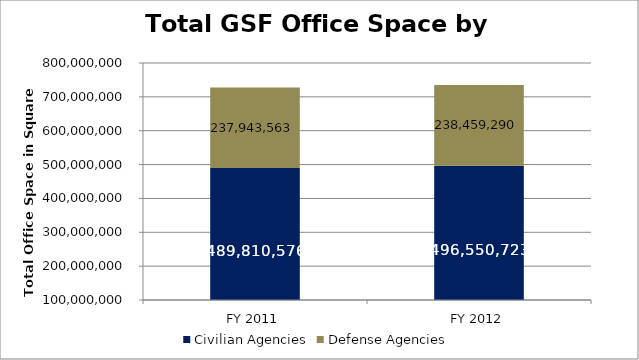
| Category | Civilian Agencies | Defense Agencies |
|---|---|---|
| FY 2011 | 489810575.65 | 237943562.79 |
| FY 2012 | 496550723.27 | 238459289.945 |